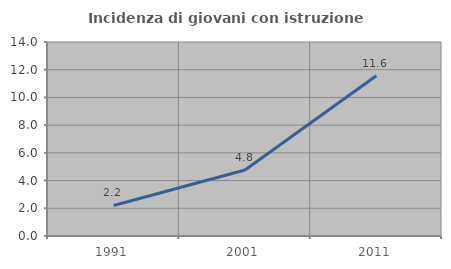
| Category | Incidenza di giovani con istruzione universitaria |
|---|---|
| 1991.0 | 2.203 |
| 2001.0 | 4.762 |
| 2011.0 | 11.561 |